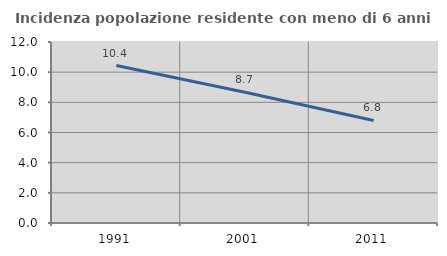
| Category | Incidenza popolazione residente con meno di 6 anni |
|---|---|
| 1991.0 | 10.437 |
| 2001.0 | 8.669 |
| 2011.0 | 6.796 |